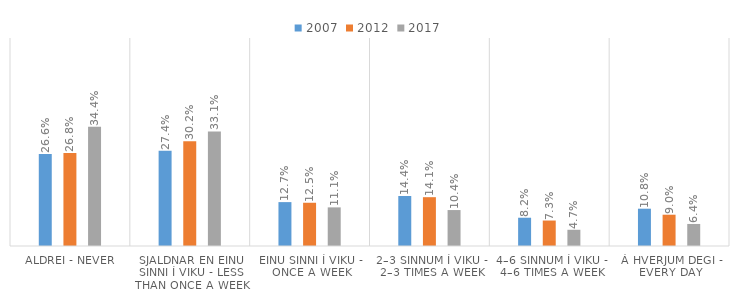
| Category | 2007 | 2012 | 2017 |
|---|---|---|---|
| Aldrei - Never | 0.266 | 0.268 | 0.344 |
| Sjaldnar en einu sinni í viku - Less than once a week | 0.274 | 0.302 | 0.331 |
| Einu sinni í viku - Once a week | 0.127 | 0.125 | 0.111 |
| 2–3 sinnum í viku - 2–3 times a week | 0.144 | 0.141 | 0.104 |
| 4–6 sinnum í viku - 4–6 times a week | 0.082 | 0.073 | 0.047 |
| Á hverjum degi - Every day | 0.108 | 0.09 | 0.064 |